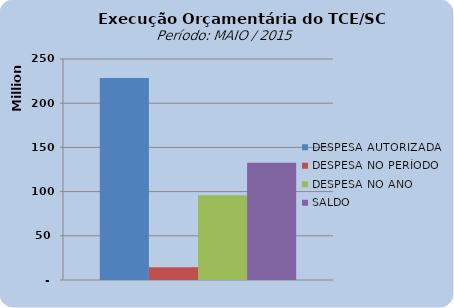
| Category | DESPESA AUTORIZADA | DESPESA NO PERÍODO | DESPESA NO ANO | SALDO |
|---|---|---|---|---|
| 0 | 228415643.73 | 14384465.62 | 95842011.47 | 132573632.26 |